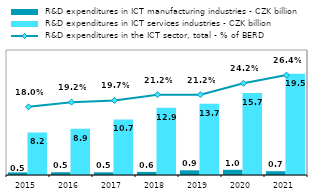
| Category |  R&D expenditures in ICT manufacturing industries - CZK billion |  R&D expenditures in ICT services industries - CZK billion |
|---|---|---|
| 2015.0 | 0.5 | 8.162 |
| 2016.0 | 0.532 | 8.889 |
| 2017.0 | 0.512 | 10.677 |
| 2018.0 | 0.591 | 12.903 |
| 2019.0 | 0.902 | 13.698 |
| 2020.0 | 0.999 | 15.74 |
| 2021.0 | 0.727 | 19.463 |